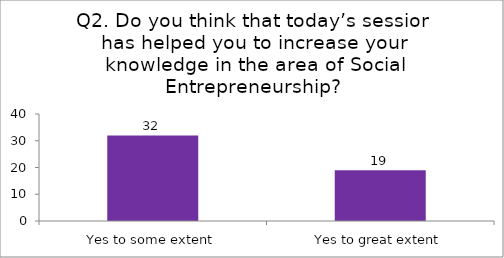
| Category | Q2. Do you think that today’s session have helped you to increase your knowledge in the area of Social Entrepreneurship? |
|---|---|
| Yes to some extent | 32 |
| Yes to great extent | 19 |